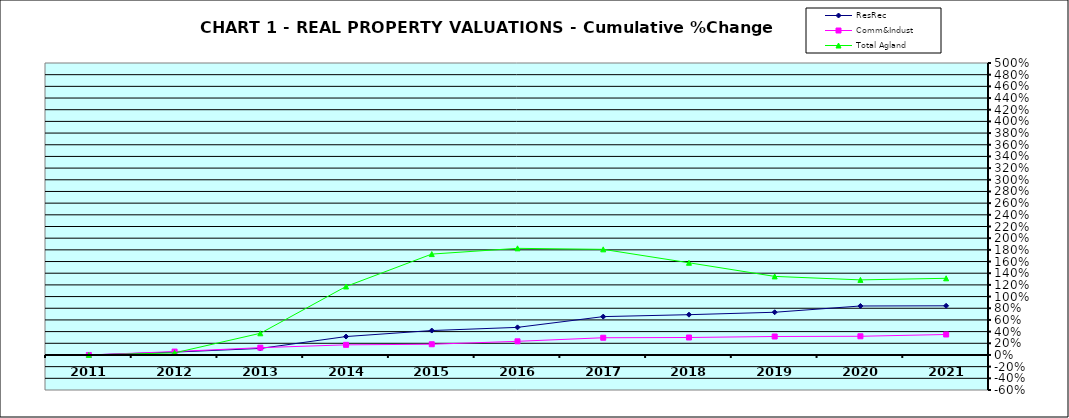
| Category | ResRec | Comm&Indust | Total Agland |
|---|---|---|---|
| 2011.0 | 0 | 0 | 0 |
| 2012.0 | 0.049 | 0.058 | 0.036 |
| 2013.0 | 0.112 | 0.125 | 0.371 |
| 2014.0 | 0.315 | 0.174 | 1.173 |
| 2015.0 | 0.418 | 0.184 | 1.728 |
| 2016.0 | 0.473 | 0.234 | 1.826 |
| 2017.0 | 0.657 | 0.295 | 1.809 |
| 2018.0 | 0.69 | 0.299 | 1.579 |
| 2019.0 | 0.731 | 0.316 | 1.345 |
| 2020.0 | 0.839 | 0.32 | 1.286 |
| 2021.0 | 0.842 | 0.35 | 1.313 |